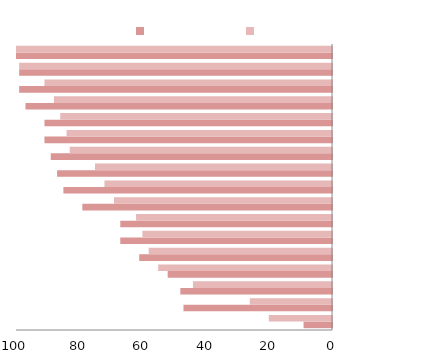
| Category | 2011 | 1990 |
|---|---|---|
| Somalia | -9 | -20 |
| Mauritania | -47 | -26 |
| Iraq | -48 | -44 |
| Morocco | -52 | -55 |
| Sudan | -61 | -58 |
| Yemen | -67 | -60 |
| Tunisia | -67 | -62 |
| Djibouti | -79 | -69 |
| Oman | -85 | -72 |
| Syria | -87 | -75 |
| Comoros | -89 | -83 |
| Palestine | -91 | -84 |
| Egypt | -91 | -86 |
| Algeria | -97 | -88 |
| Jordan | -99 | -91 |
| Kuwait | -99 | -99 |
| Lebanon | -100 | -100 |